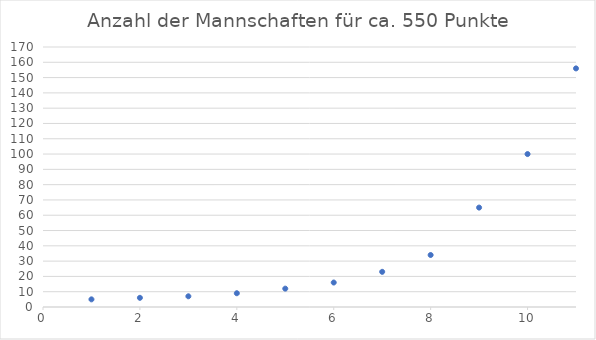
| Category | Series 0 |
|---|---|
| 0 | 5 |
| 1 | 6 |
| 2 | 7 |
| 3 | 9 |
| 4 | 12 |
| 5 | 16 |
| 6 | 23 |
| 7 | 34 |
| 8 | 65 |
| 9 | 100 |
| 10 | 156 |